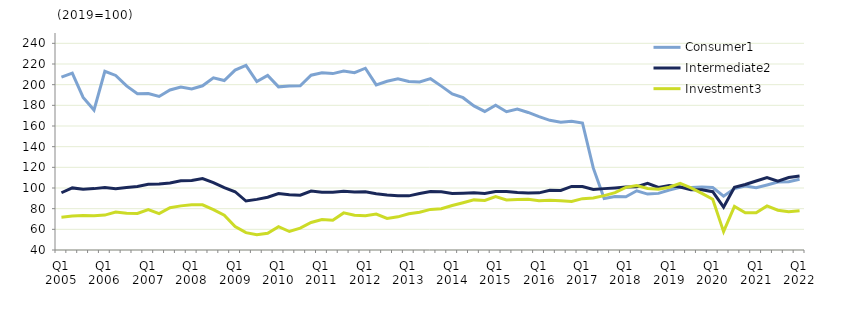
| Category | Consumer1 | Intermediate2 | Investment3 |
|---|---|---|---|
| Q1 2005 | 207.3 | 95.4 | 71.8 |
|  | 211.2 | 100.1 | 72.8 |
| Q3 2005 | 187.6 | 98.9 | 73.5 |
|  | 175.4 | 99.4 | 73.1 |
| Q1 2006 | 213 | 100.4 | 73.8 |
|  | 208.9 | 99.3 | 76.7 |
| Q3 2006 | 198.8 | 100.5 | 75.5 |
|  | 191.3 | 101.5 | 75.4 |
| Q1 2007 | 191.5 | 103.6 | 79.2 |
|  | 188.6 | 103.8 | 75.2 |
| Q3 2007 | 194.9 | 104.9 | 80.9 |
|  | 197.8 | 107.1 | 82.7 |
| Q1 2008 | 195.9 | 107.3 | 83.9 |
|  | 198.9 | 109.1 | 83.7 |
| Q3 2008 | 206.6 | 105.3 | 79.1 |
|  | 204 | 100.3 | 73.7 |
| Q1 2009 | 214.1 | 96.4 | 62.8 |
|  | 218.7 | 87.4 | 56.8 |
| Q3 2009 | 203 | 89 | 54.8 |
|  | 209 | 91.1 | 56.2 |
| Q1 2010 | 197.9 | 94.6 | 62.6 |
|  | 198.8 | 93.5 | 57.9 |
| Q3 2010 | 198.9 | 93 | 61.1 |
|  | 209.2 | 97.1 | 66.6 |
| Q1 2011 | 211.5 | 95.8 | 69.5 |
|  | 210.7 | 95.8 | 68.9 |
| Q3 2011 | 213.3 | 96.8 | 75.9 |
|  | 211.6 | 96.1 | 73.7 |
| Q1 2012 | 215.9 | 96.3 | 73.1 |
|  | 199.8 | 94.4 | 74.8 |
| Q3 2012 | 203.3 | 93.3 | 70.6 |
|  | 205.7 | 92.6 | 72.1 |
| Q1 2013 | 203 | 92.4 | 75 |
|  | 202.7 | 94.6 | 76.6 |
| Q3 2013 | 205.8 | 96.5 | 79.3 |
|  | 198.6 | 96.4 | 79.9 |
| Q1 2014 | 191.1 | 94.6 | 83.1 |
|  | 187.4 | 95 | 85.7 |
| Q3 2014 | 179.4 | 95.5 | 88.5 |
|  | 174.1 | 94.8 | 88 |
| Q1 2015 | 180.1 | 96.6 | 91.6 |
|  | 173.8 | 96.7 | 88.5 |
| Q3 2015 | 176.3 | 95.6 | 88.8 |
|  | 173.1 | 95.2 | 89.2 |
| Q1 2016 | 169.1 | 95.3 | 87.6 |
|  | 165.5 | 97.9 | 88.1 |
| Q3 2016 | 163.7 | 97.7 | 87.6 |
|  | 164.6 | 101.5 | 87 |
| Q1 2017 | 162.9 | 101.4 | 89.7 |
|  | 119.2 | 98.5 | 90.4 |
| Q3 2017 | 89.9 | 99.4 | 92.6 |
|  | 91.7 | 100.1 | 95.5 |
| Q1 2018 | 91.5 | 101 | 100.6 |
|  | 97.3 | 101.2 | 102.4 |
| Q3 2018 | 94.1 | 104.5 | 99.6 |
|  | 94.8 | 100.5 | 98.7 |
| Q1 2019 | 98 | 102.3 | 100.7 |
|  | 100.7 | 101 | 104.4 |
| Q3 2019 | 100.4 | 98.4 | 100.2 |
|  | 100.9 | 98.4 | 94.8 |
| Q1 2020 | 100.5 | 96.4 | 89.1 |
|  | 92.1 | 81.5 | 57.8 |
| Q3 2020 | 99.4 | 100.8 | 82.2 |
|  | 101.8 | 103.4 | 76.1 |
| Q1 2021 | 100.3 | 106.8 | 76 |
|  | 102.9 | 110.2 | 82.7 |
| Q3 2021 | 105.7 | 106.7 | 78.5 |
|  | 106.1 | 110.2 | 77 |
| Q1 2022 | 108.4 | 111.6 | 78 |